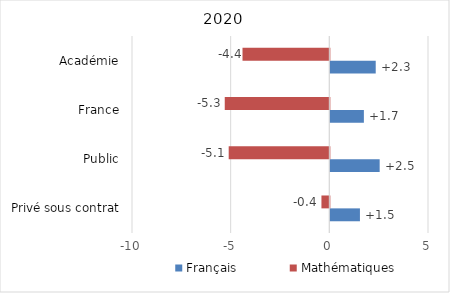
| Category | Français | Mathématiques |
|---|---|---|
| Privé sous contrat | 1.5 | -0.4 |
| Public | 2.5 | -5.1 |
| France | 1.7 | -5.3 |
| Académie | 2.3 | -4.4 |